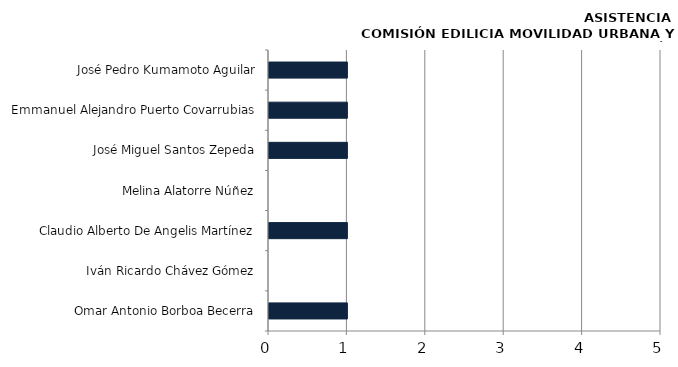
| Category | Series 0 |
|---|---|
| Omar Antonio Borboa Becerra | 1 |
|  Iván Ricardo Chávez Gómez | 0 |
| Claudio Alberto De Angelis Martínez | 1 |
|  Melina Alatorre Núñez | 0 |
| José Miguel Santos Zepeda | 1 |
| Emmanuel Alejandro Puerto Covarrubias | 1 |
| José Pedro Kumamoto Aguilar | 1 |